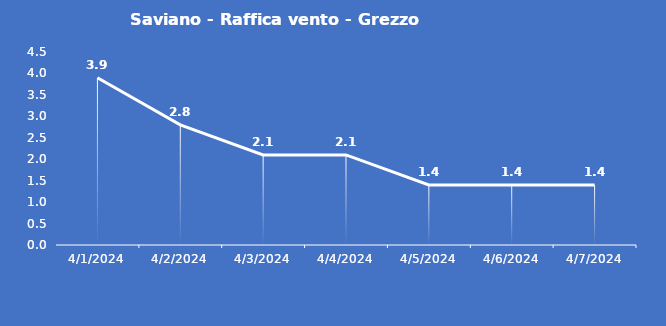
| Category | Saviano - Raffica vento - Grezzo (m/s) |
|---|---|
| 4/1/24 | 3.9 |
| 4/2/24 | 2.8 |
| 4/3/24 | 2.1 |
| 4/4/24 | 2.1 |
| 4/5/24 | 1.4 |
| 4/6/24 | 1.4 |
| 4/7/24 | 1.4 |